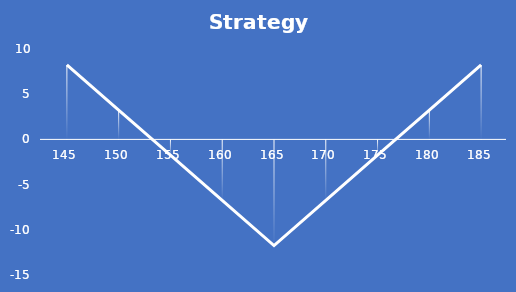
| Category | Profit |
|---|---|
| 145.0 | 8.25 |
| 150.0 | 3.25 |
| 155.0 | -1.75 |
| 160.0 | -6.75 |
| 165.0 | -11.75 |
| 170.0 | -6.75 |
| 175.0 | -1.75 |
| 180.0 | 3.25 |
| 185.0 | 8.25 |